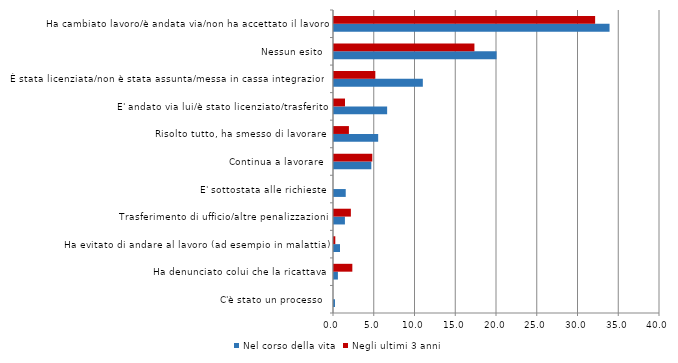
| Category | Nel corso della vita | Negli ultimi 3 anni |
|---|---|---|
| C'è stato un processo | 0.12 | 0 |
| Ha denunciato colui che la ricattava | 0.48 | 2.25 |
| Ha evitato di andare al lavoro (ad esempio in malattia) | 0.74 | 0.16 |
| Trasferimento di ufficio/altre penalizzazioni | 1.34 | 2.07 |
| E' sottostata alle richieste | 1.44 | 0 |
| Continua a lavorare | 4.58 | 4.7 |
| Risolto tutto, ha smesso di lavorare | 5.42 | 1.83 |
| E' andato via lui/è stato licenziato/trasferito | 6.52 | 1.35 |
| È stata licenziata/non è stata assunta/messa in cassa integrazione | 10.9 | 5.07 |
| Nessun esito | 19.95 | 17.23 |
| Ha cambiato lavoro/è andata via/non ha accettato il lavoro | 33.81 | 32.04 |